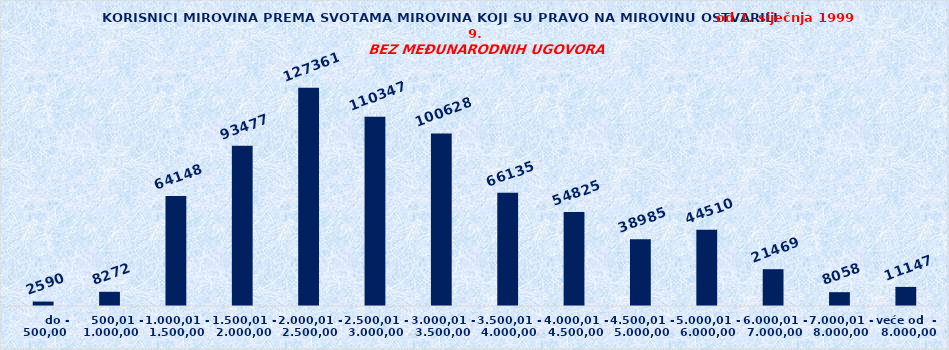
| Category | Series 0 |
|---|---|
|       do - 500,00 | 2590 |
|    500,01 - 1.000,00 | 8272 |
| 1.000,01 - 1.500,00 | 64148 |
| 1.500,01 - 2.000,00 | 93477 |
| 2.000,01 - 2.500,00 | 127361 |
| 2.500,01 - 3.000,00 | 110347 |
| 3.000,01 - 3.500,00 | 100628 |
| 3.500,01 - 4.000,00 | 66135 |
| 4.000,01 - 4.500,00 | 54825 |
| 4.500,01 - 5.000,00 | 38985 |
| 5.000,01 - 6.000,00 | 44510 |
| 6.000,01 - 7.000,00 | 21469 |
| 7.000,01 - 8.000,00 | 8058 |
| veće od  -  8.000,00 | 11147 |